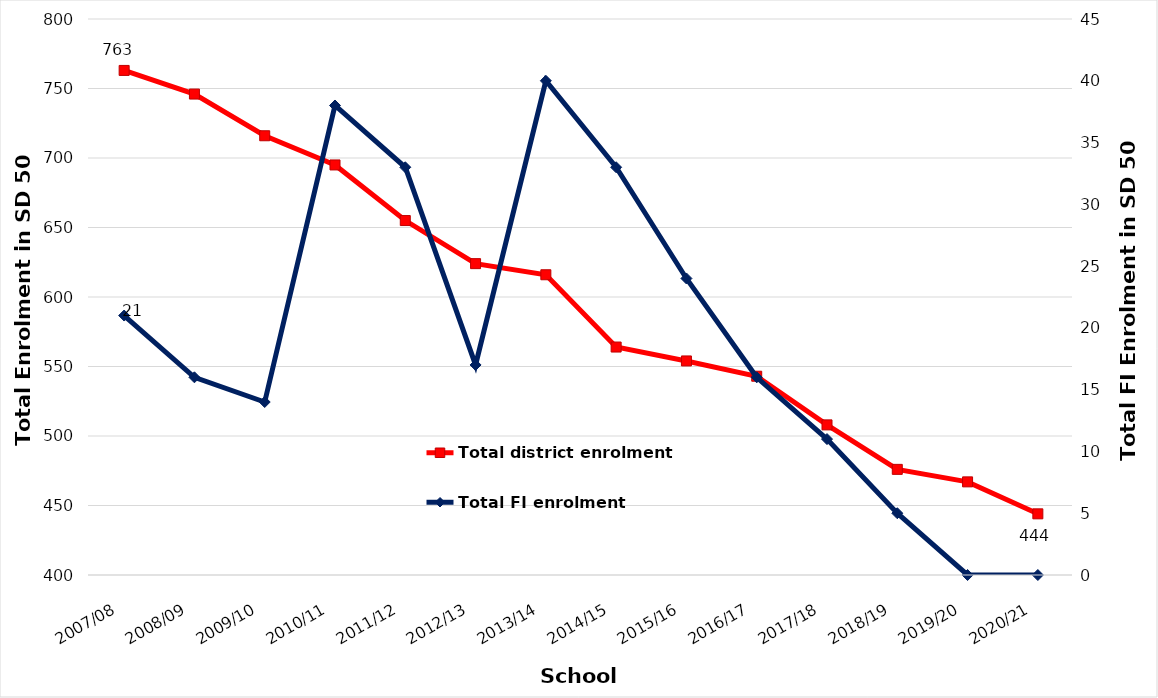
| Category | Total district enrolment  |
|---|---|
| 2007/08 | 763 |
| 2008/09 | 746 |
| 2009/10 | 716 |
| 2010/11 | 695 |
| 2011/12 | 655 |
| 2012/13 | 624 |
| 2013/14 | 616 |
| 2014/15 | 564 |
| 2015/16 | 554 |
| 2016/17 | 543 |
| 2017/18 | 508 |
| 2018/19 | 476 |
| 2019/20 | 467 |
| 2020/21 | 444 |